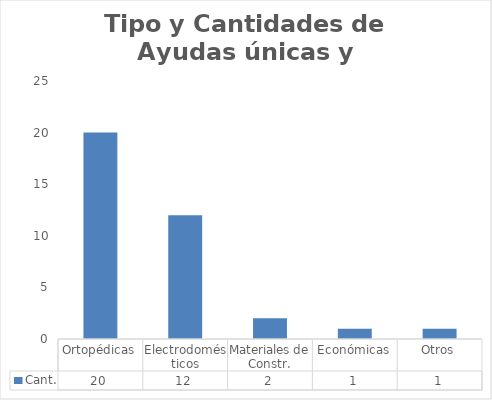
| Category | Cant. |
|---|---|
| Ortopédicas | 20 |
| Electrodomésticos | 12 |
| Materiales de Constr. | 2 |
| Económicas | 1 |
| Otros | 1 |